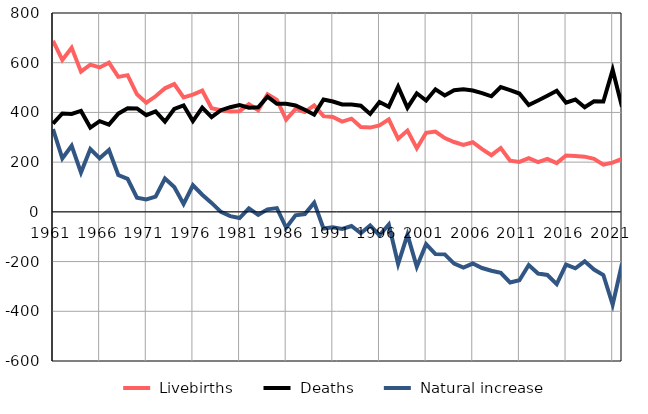
| Category |  Livebirths |  Deaths |  Natural increase |
|---|---|---|---|
| 1961.0 | 688 | 355 | 333 |
| 1962.0 | 611 | 396 | 215 |
| 1963.0 | 660 | 394 | 266 |
| 1964.0 | 564 | 406 | 158 |
| 1965.0 | 592 | 339 | 253 |
| 1966.0 | 581 | 365 | 216 |
| 1967.0 | 600 | 351 | 249 |
| 1968.0 | 543 | 395 | 148 |
| 1969.0 | 550 | 417 | 133 |
| 1970.0 | 473 | 416 | 57 |
| 1971.0 | 439 | 389 | 50 |
| 1972.0 | 465 | 404 | 61 |
| 1973.0 | 497 | 363 | 134 |
| 1974.0 | 514 | 414 | 100 |
| 1975.0 | 460 | 428 | 32 |
| 1976.0 | 472 | 365 | 107 |
| 1977.0 | 488 | 419 | 69 |
| 1978.0 | 417 | 381 | 36 |
| 1979.0 | 409 | 409 | 0 |
| 1980.0 | 404 | 421 | -17 |
| 1981.0 | 405 | 430 | -25 |
| 1982.0 | 433 | 419 | 14 |
| 1983.0 | 409 | 421 | -12 |
| 1984.0 | 473 | 463 | 10 |
| 1985.0 | 450 | 435 | 15 |
| 1986.0 | 371 | 435 | -64 |
| 1987.0 | 414 | 428 | -14 |
| 1988.0 | 402 | 411 | -9 |
| 1989.0 | 428 | 391 | 37 |
| 1990.0 | 385 | 452 | -67 |
| 1991.0 | 382 | 444 | -62 |
| 1992.0 | 363 | 432 | -69 |
| 1993.0 | 375 | 432 | -57 |
| 1994.0 | 341 | 427 | -86 |
| 1995.0 | 339 | 394 | -55 |
| 1996.0 | 348 | 442 | -94 |
| 1997.0 | 372 | 423 | -51 |
| 1998.0 | 294 | 504 | -210 |
| 1999.0 | 327 | 419 | -92 |
| 2000.0 | 256 | 477 | -221 |
| 2001.0 | 318 | 448 | -130 |
| 2002.0 | 323 | 493 | -170 |
| 2003.0 | 297 | 468 | -171 |
| 2004.0 | 281 | 489 | -208 |
| 2005.0 | 269 | 493 | -224 |
| 2006.0 | 280 | 488 | -208 |
| 2007.0 | 252 | 478 | -226 |
| 2008.0 | 228 | 465 | -237 |
| 2009.0 | 257 | 502 | -245 |
| 2010.0 | 206 | 490 | -284 |
| 2011.0 | 201 | 476 | -275 |
| 2012.0 | 216 | 430 | -214 |
| 2013.0 | 200 | 448 | -248 |
| 2014.0 | 213 | 467 | -254 |
| 2015.0 | 196 | 487 | -291 |
| 2016.0 | 227 | 439 | -212 |
| 2017.0 | 225 | 452 | -227 |
| 2018.0 | 222 | 421 | -199 |
| 2019.0 | 213 | 445 | -232 |
| 2020.0 | 190 | 444 | -254 |
| 2021.0 | 198 | 571 | -373 |
| 2022.0 | 214 | 423 | -209 |